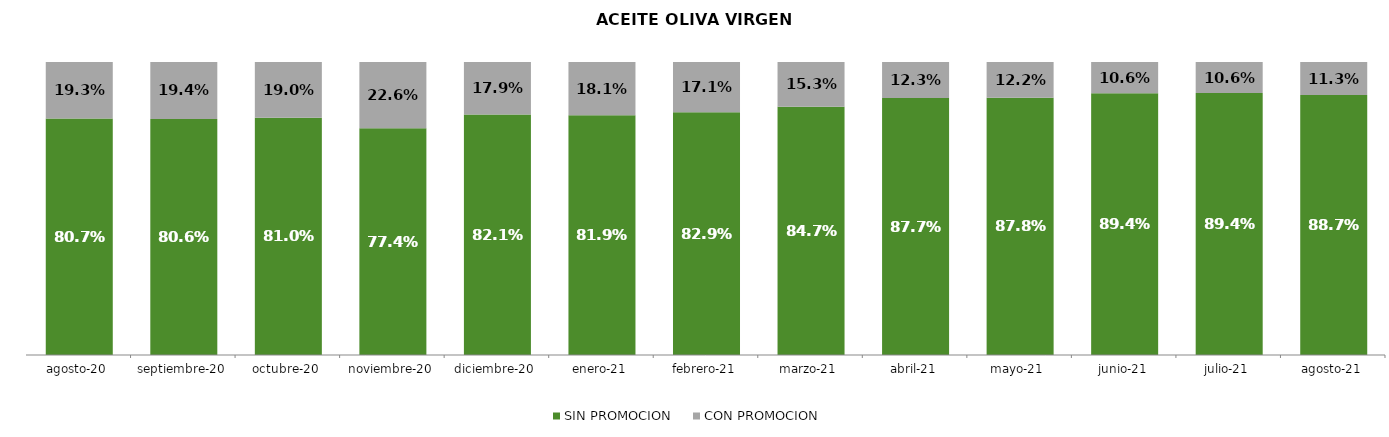
| Category | SIN PROMOCION   | CON PROMOCION   |
|---|---|---|
| 2020-08-01 | 0.807 | 0.193 |
| 2020-09-01 | 0.806 | 0.194 |
| 2020-10-01 | 0.81 | 0.19 |
| 2020-11-01 | 0.774 | 0.226 |
| 2020-12-01 | 0.821 | 0.179 |
| 2021-01-01 | 0.819 | 0.181 |
| 2021-02-01 | 0.829 | 0.171 |
| 2021-03-01 | 0.847 | 0.153 |
| 2021-04-01 | 0.877 | 0.123 |
| 2021-05-01 | 0.878 | 0.122 |
| 2021-06-01 | 0.894 | 0.106 |
| 2021-07-01 | 0.894 | 0.106 |
| 2021-08-01 | 0.887 | 0.113 |